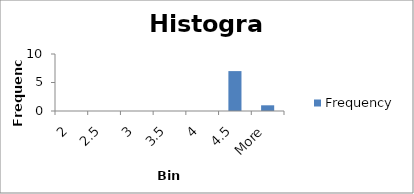
| Category | Frequency |
|---|---|
| 2 | 0 |
| 2.5 | 0 |
| 3 | 0 |
| 3.5 | 0 |
| 4 | 0 |
| 4.5 | 7 |
| More | 1 |